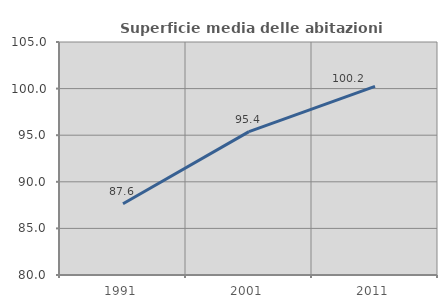
| Category | Superficie media delle abitazioni occupate |
|---|---|
| 1991.0 | 87.65 |
| 2001.0 | 95.383 |
| 2011.0 | 100.235 |